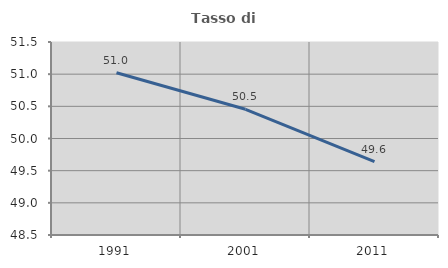
| Category | Tasso di occupazione   |
|---|---|
| 1991.0 | 51.023 |
| 2001.0 | 50.454 |
| 2011.0 | 49.64 |